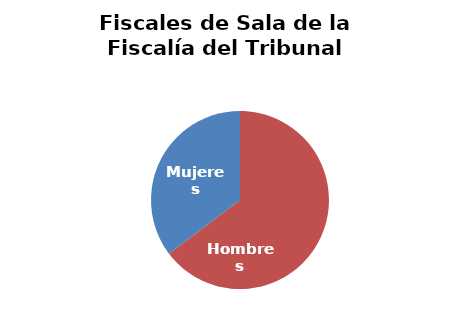
| Category | Fiscales de Sala de la Fiscalía del Tribunal Supremo |
|---|---|
| Hombres | 11 |
| Mujeres | 6 |